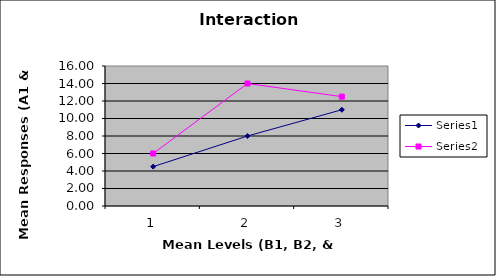
| Category | Series 0 | Series 1 |
|---|---|---|
| 0 | 4.5 | 6 |
| 1 | 8 | 14 |
| 2 | 11 | 12.5 |